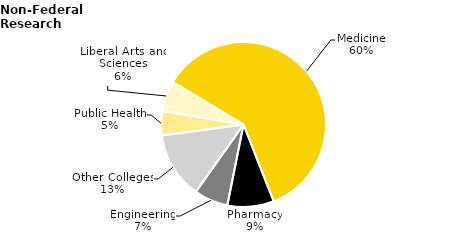
| Category | Series 0 |
|---|---|
| Medicine | 137.122 |
| Pharmacy | 20.653 |
| Engineering | 15.082 |
| Other Colleges | 29.644 |
| Public Health | 10.819 |
| Liberal Arts and Sciences | 13.594 |